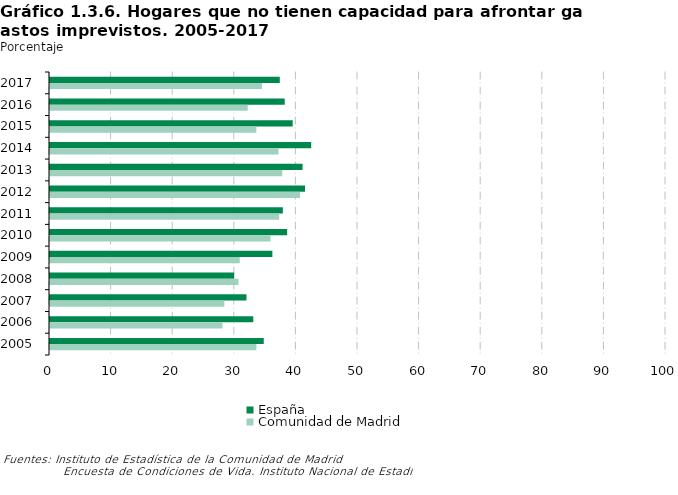
| Category | España | Comunidad de Madrid |
|---|---|---|
| 2017 | 37.3 | 34.4 |
| 2016 | 38.1 | 32.1 |
| 2015 | 39.4 | 33.5 |
| 2014 | 42.4 | 37.1 |
| 2013 | 41 | 37.7 |
| 2012 | 41.4 | 40.6 |
| 2011 | 37.8 | 37.2 |
| 2010 | 38.5 | 35.8 |
| 2009 | 36.1 | 30.8 |
| 2008 | 29.9 | 30.6 |
| 2007 | 31.9 | 28.3 |
| 2006 | 33 | 28 |
| 2005 | 34.7 | 33.5 |